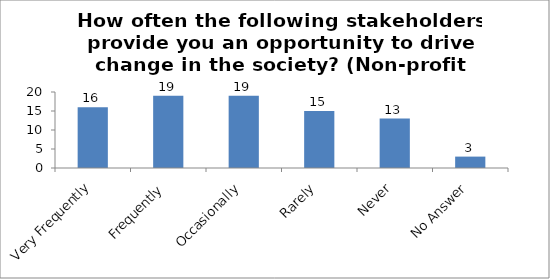
| Category | How often the following stakeholders provide you an opportunity to drive change in the society? (Non-profit institutions) |
|---|---|
| Very Frequently | 16 |
| Frequently | 19 |
| Occasionally | 19 |
| Rarely | 15 |
| Never | 13 |
| No Answer | 3 |